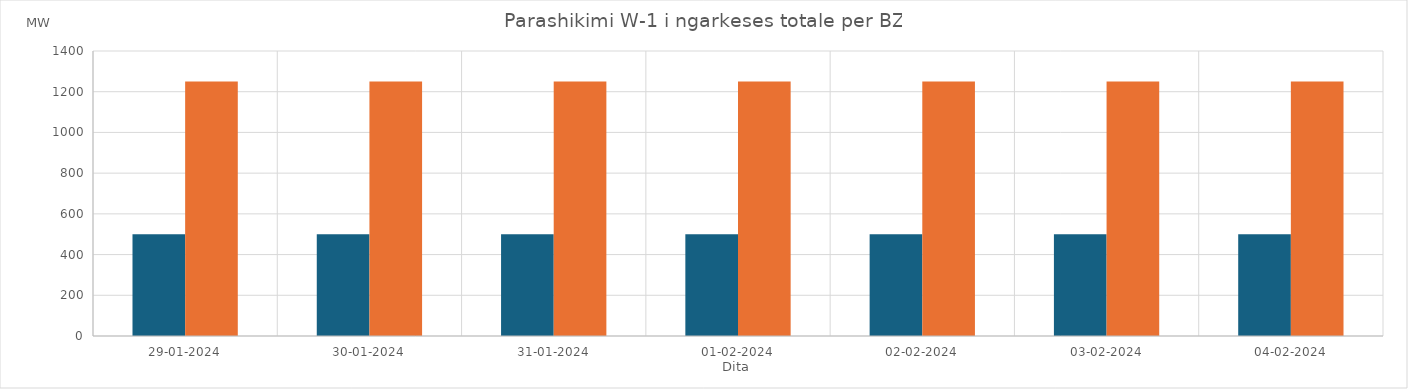
| Category | Min (MW) | Max (MW) |
|---|---|---|
| 29-01-2024 | 500 | 1250 |
| 30-01-2024 | 500 | 1250 |
| 31-01-2024 | 500 | 1250 |
| 01-02-2024 | 500 | 1250 |
| 02-02-2024 | 500 | 1250 |
| 03-02-2024 | 500 | 1250 |
| 04-02-2024 | 500 | 1250 |